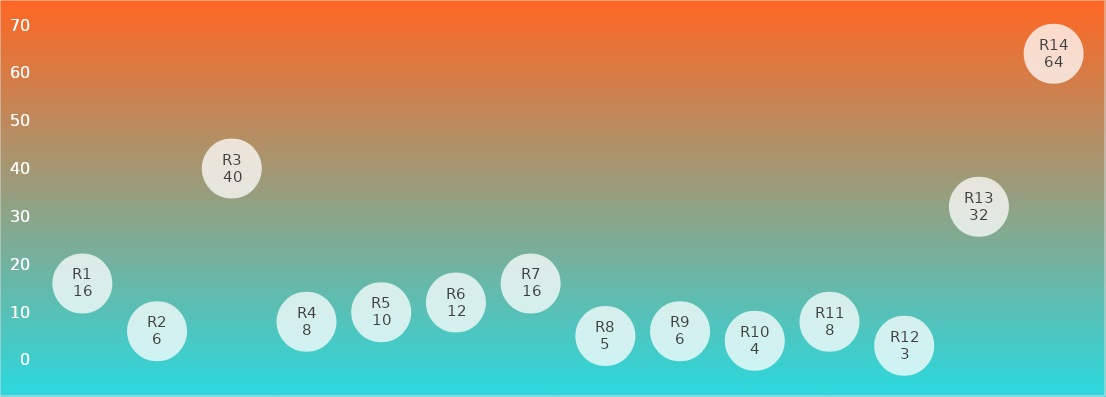
| Category | Series 0 |
|---|---|
| R1 | 16 |
| R2 | 6 |
| R3 | 40 |
| R4 | 8 |
| R5 | 10 |
| R6 | 12 |
| R7 | 16 |
| R8 | 5 |
| R9 | 6 |
| R10 | 4 |
| R11 | 8 |
| R12 | 3 |
| R13 | 32 |
| R14 | 64 |